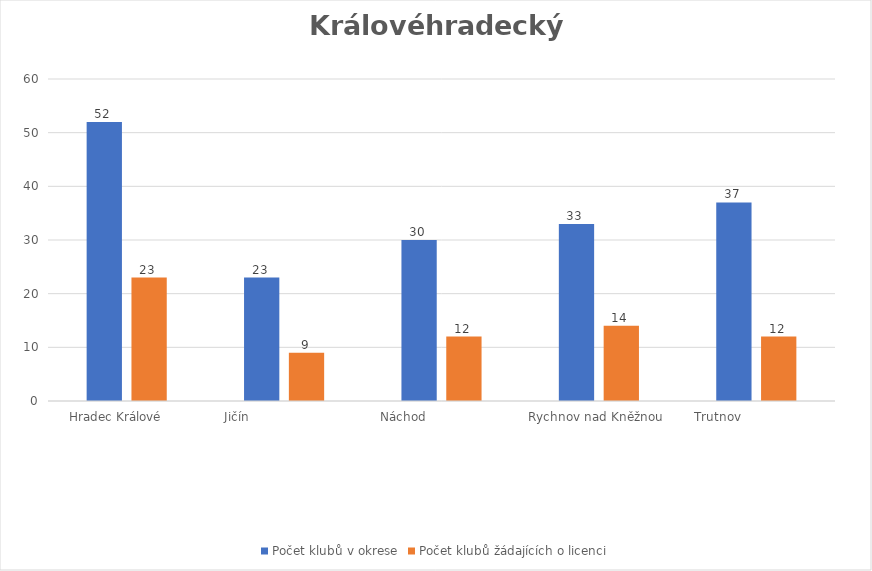
| Category | Počet klubů v okrese | Počet klubů žádajících o licenci |
|---|---|---|
| Hradec Králové      | 52 | 23 |
| Jičín                         | 23 | 9 |
| Náchod                    | 30 | 12 |
| Rychnov nad Kněžnou  | 33 | 14 |
| Trutnov                    | 37 | 12 |